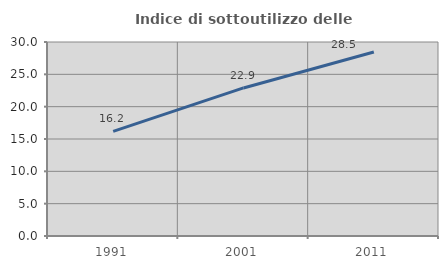
| Category | Indice di sottoutilizzo delle abitazioni  |
|---|---|
| 1991.0 | 16.181 |
| 2001.0 | 22.897 |
| 2011.0 | 28.458 |